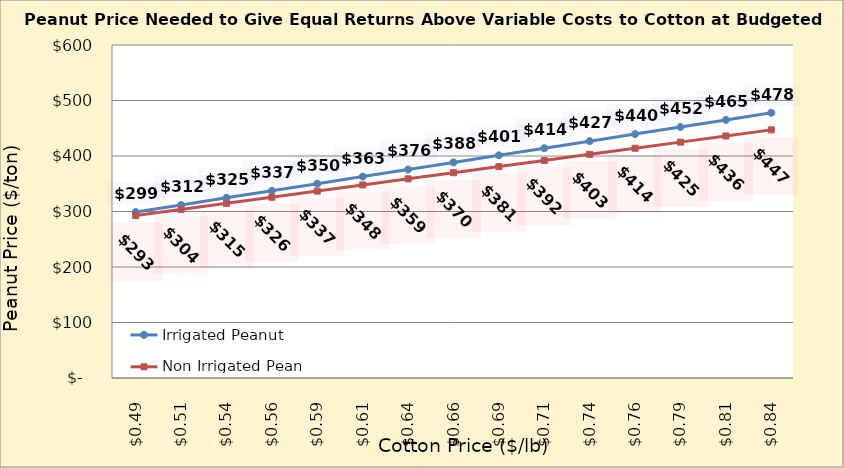
| Category | Irrigated Peanut | Non Irrigated Peanut |
|---|---|---|
| 0.4849999999999999 | 299.087 | 292.669 |
| 0.5099999999999999 | 311.853 | 303.699 |
| 0.5349999999999999 | 324.619 | 314.728 |
| 0.5599999999999999 | 337.385 | 325.758 |
| 0.585 | 350.151 | 336.787 |
| 0.61 | 362.917 | 347.817 |
| 0.635 | 375.683 | 358.846 |
| 0.66 | 388.449 | 369.875 |
| 0.685 | 401.214 | 380.905 |
| 0.7100000000000001 | 413.98 | 391.934 |
| 0.7350000000000001 | 426.746 | 402.964 |
| 0.7600000000000001 | 439.512 | 413.993 |
| 0.7850000000000001 | 452.278 | 425.022 |
| 0.8100000000000002 | 465.044 | 436.052 |
| 0.8350000000000002 | 477.81 | 447.081 |